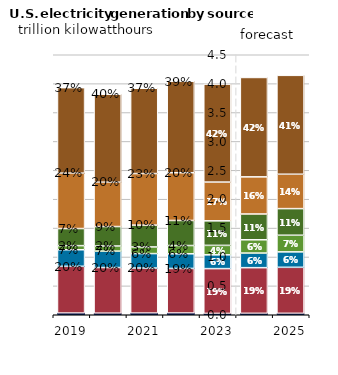
| Category | Other | Nuclear | Hydro | Solar | Wind | Coal | Natural |
|---|---|---|---|---|---|---|---|
| 2019.0 | 0.029 | 0.809 | 0.287 | 0.071 | 0.296 | 0.959 | 1.48 |
| 2020.0 | 0.027 | 0.79 | 0.284 | 0.089 | 0.337 | 0.768 | 1.522 |
| 2021.0 | 0.029 | 0.78 | 0.25 | 0.115 | 0.378 | 0.892 | 1.477 |
| 2022.0 | 0.03 | 0.772 | 0.254 | 0.143 | 0.434 | 0.826 | 1.583 |
| 2023.0 | 0.023 | 0.775 | 0.239 | 0.163 | 0.425 | 0.671 | 1.695 |
| 2024.0 | 0.024 | 0.79 | 0.253 | 0.23 | 0.446 | 0.643 | 1.72 |
| 2025.0 | 0.024 | 0.797 | 0.267 | 0.288 | 0.461 | 0.595 | 1.712 |